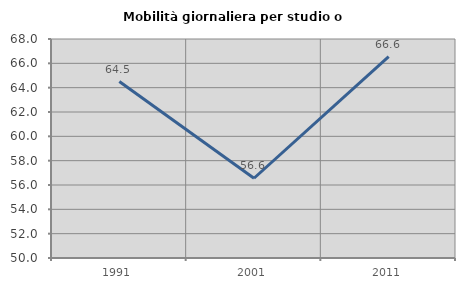
| Category | Mobilità giornaliera per studio o lavoro |
|---|---|
| 1991.0 | 64.501 |
| 2001.0 | 56.554 |
| 2011.0 | 66.556 |